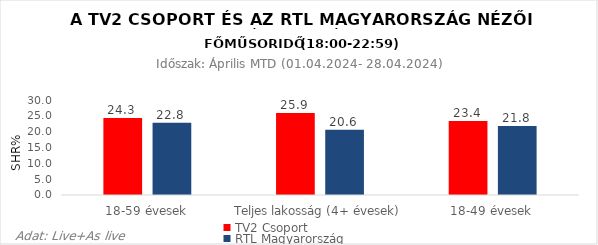
| Category | TV2 Csoport | RTL Magyarország |
|---|---|---|
| 18-59 évesek | 24.3 | 22.8 |
| Teljes lakosság (4+ évesek) | 25.9 | 20.6 |
| 18-49 évesek | 23.4 | 21.8 |